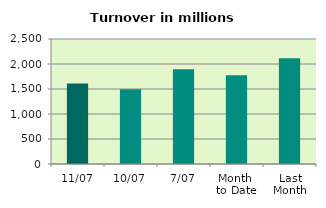
| Category | Series 0 |
|---|---|
| 11/07 | 1610.198 |
| 10/07 | 1492.799 |
| 7/07 | 1894.215 |
| Month 
to Date | 1776.395 |
| Last
Month | 2115.436 |